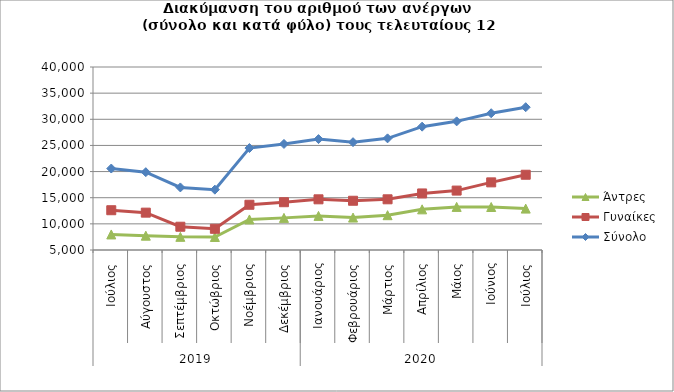
| Category | Άντρες | Γυναίκες | Σύνολο |
|---|---|---|---|
| 0 | 7975 | 12607 | 20582 |
| 1 | 7739 | 12144 | 19883 |
| 2 | 7518 | 9450 | 16968 |
| 3 | 7491 | 9053 | 16544 |
| 4 | 10842 | 13653 | 24495 |
| 5 | 11144 | 14141 | 25285 |
| 6 | 11522 | 14692 | 26214 |
| 7 | 11203 | 14417 | 25620 |
| 8 | 11658 | 14695 | 26353 |
| 9 | 12774 | 15817 | 28591 |
| 10 | 13242 | 16362 | 29604 |
| 11 | 13223 | 17935 | 31158 |
| 12 | 12918 | 19395 | 32313 |